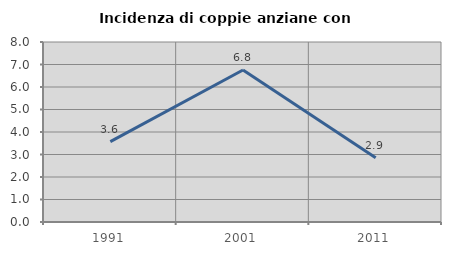
| Category | Incidenza di coppie anziane con figli |
|---|---|
| 1991.0 | 3.571 |
| 2001.0 | 6.757 |
| 2011.0 | 2.857 |